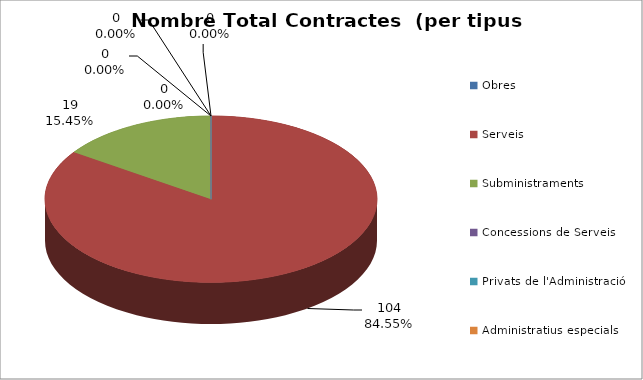
| Category | Nombre Total Contractes |
|---|---|
| Obres | 0 |
| Serveis | 104 |
| Subministraments | 19 |
| Concessions de Serveis | 0 |
| Privats de l'Administració | 0 |
| Administratius especials | 0 |